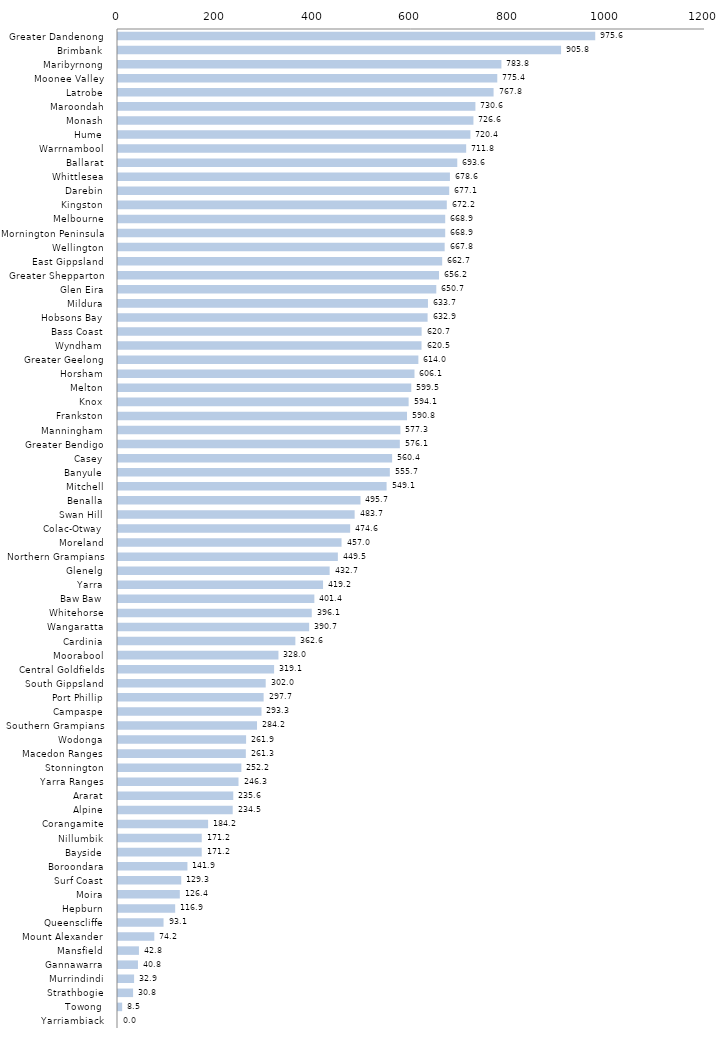
| Category | Series 0 |
|---|---|
| Greater Dandenong  | 975.581 |
| Brimbank  | 905.773 |
| Maribyrnong  | 783.792 |
| Moonee Valley  | 775.354 |
| Latrobe  | 767.798 |
| Maroondah  | 730.632 |
| Monash  | 726.598 |
| Hume  | 720.385 |
| Warrnambool  | 711.752 |
| Ballarat  | 693.565 |
| Whittlesea  | 678.557 |
| Darebin  | 677.096 |
| Kingston  | 672.155 |
| Melbourne  | 668.92 |
| Mornington Peninsula  | 668.913 |
| Wellington  | 667.798 |
| East Gippsland  | 662.719 |
| Greater Shepparton  | 656.246 |
| Glen Eira  | 650.674 |
| Mildura  | 633.655 |
| Hobsons Bay  | 632.903 |
| Bass Coast  | 620.706 |
| Wyndham  | 620.483 |
| Greater Geelong  | 614.022 |
| Horsham  | 606.096 |
| Melton  | 599.538 |
| Knox  | 594.129 |
| Frankston  | 590.815 |
| Manningham  | 577.283 |
| Greater Bendigo  | 576.144 |
| Casey  | 560.354 |
| Banyule  | 555.704 |
| Mitchell  | 549.068 |
| Benalla  | 495.736 |
| Swan Hill  | 483.749 |
| Colac-Otway  | 474.568 |
| Moreland  | 456.967 |
| Northern Grampians  | 449.453 |
| Glenelg  | 432.678 |
| Yarra  | 419.178 |
| Baw Baw  | 401.403 |
| Whitehorse  | 396.096 |
| Wangaratta  | 390.734 |
| Cardinia  | 362.587 |
| Moorabool  | 327.988 |
| Central Goldfields  | 319.121 |
| South Gippsland  | 301.956 |
| Port Phillip  | 297.696 |
| Campaspe  | 293.348 |
| Southern Grampians  | 284.169 |
| Wodonga  | 261.859 |
| Macedon Ranges  | 261.319 |
| Stonnington  | 252.157 |
| Yarra Ranges  | 246.34 |
| Ararat  | 235.598 |
| Alpine  | 234.491 |
| Corangamite  | 184.216 |
| Nillumbik  | 171.174 |
| Bayside  | 171.15 |
| Boroondara  | 141.934 |
| Surf Coast  | 129.262 |
| Moira  | 126.367 |
| Hepburn  | 116.873 |
| Queenscliffe  | 93.125 |
| Mount Alexander  | 74.225 |
| Mansfield  | 42.815 |
| Gannawarra  | 40.799 |
| Murrindindi  | 32.904 |
| Strathbogie  | 30.838 |
| Towong  | 8.478 |
| Yarriambiack  | 0 |